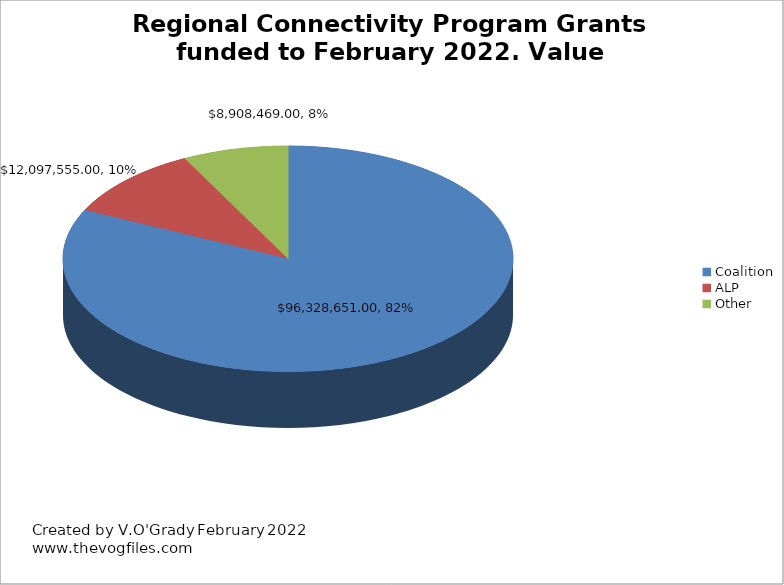
| Category | Regional Connectivity program Grants funded to february 2022. Value $117,334,675.00 |
|---|---|
| Coalition | 96328651 |
| ALP | 12097555 |
| Other | 8908469 |